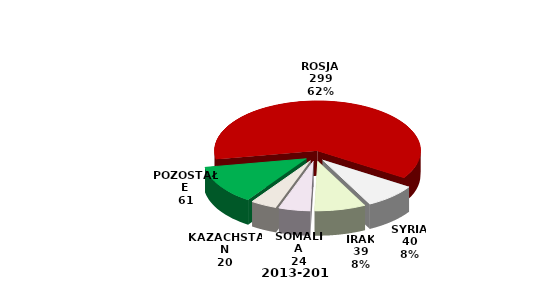
| Category | Series 0 |
|---|---|
| ROSJA | 299 |
| SYRIA | 40 |
| IRAK | 39 |
| SOMALIA | 24 |
| KAZACHSTAN | 20 |
| POZOSTAŁE | 61 |